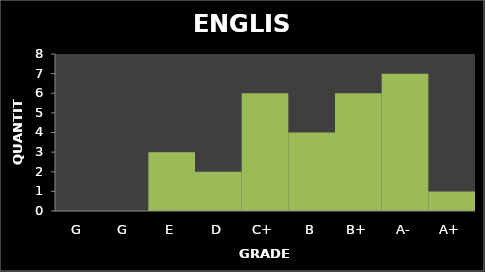
| Category | Quantity |
|---|---|
| G | 0 |
| G | 0 |
| E | 3 |
| D | 2 |
| C+ | 6 |
| B | 4 |
| B+ | 6 |
| A- | 7 |
| A+ | 1 |